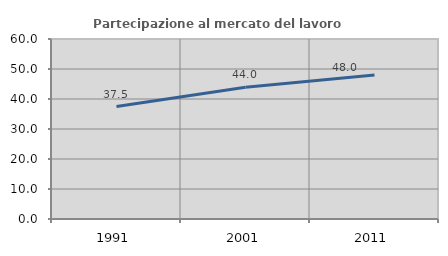
| Category | Partecipazione al mercato del lavoro  femminile |
|---|---|
| 1991.0 | 37.494 |
| 2001.0 | 43.952 |
| 2011.0 | 48.039 |